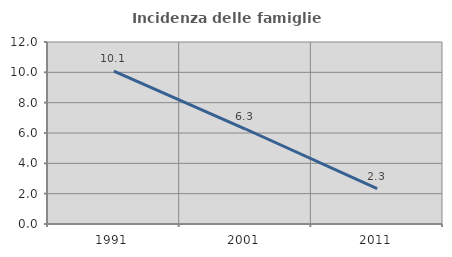
| Category | Incidenza delle famiglie numerose |
|---|---|
| 1991.0 | 10.082 |
| 2001.0 | 6.263 |
| 2011.0 | 2.339 |